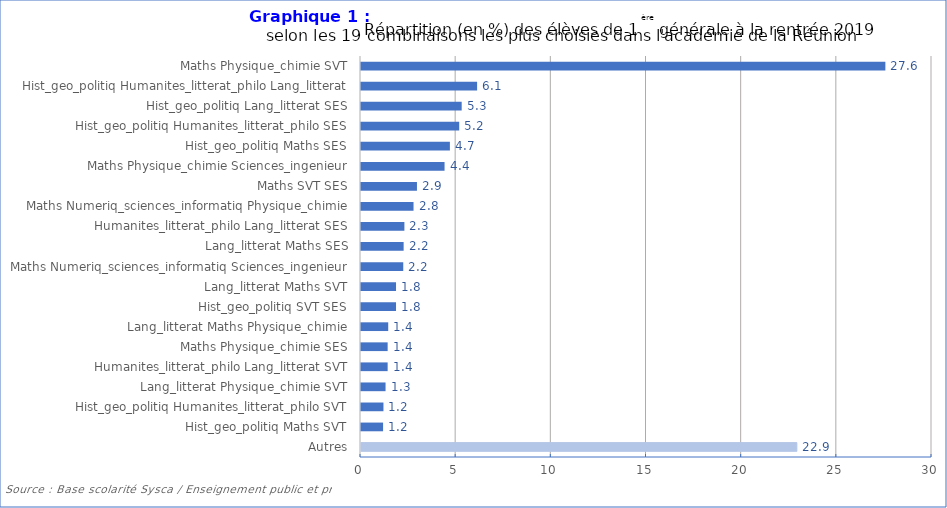
| Category | Series 1 |
|---|---|
| Autres | 22.9 |
| Hist_geo_politiq Maths SVT | 1.16 |
| Hist_geo_politiq Humanites_litterat_philo SVT | 1.18 |
| Lang_litterat Physique_chimie SVT | 1.29 |
| Humanites_litterat_philo Lang_litterat SVT | 1.4 |
| Maths Physique_chimie SES | 1.4 |
| Lang_litterat Maths Physique_chimie | 1.43 |
| Hist_geo_politiq SVT SES | 1.84 |
| Lang_litterat Maths SVT | 1.84 |
| Maths Numeriq_sciences_informatiq Sciences_ingenieur | 2.22 |
| Lang_litterat Maths SES | 2.24 |
| Humanites_litterat_philo Lang_litterat SES | 2.28 |
| Maths Numeriq_sciences_informatiq Physique_chimie | 2.76 |
| Maths SVT SES | 2.94 |
| Maths Physique_chimie Sciences_ingenieur | 4.39 |
| Hist_geo_politiq Maths SES | 4.67 |
| Hist_geo_politiq Humanites_litterat_philo SES | 5.16 |
| Hist_geo_politiq Lang_litterat SES | 5.29 |
| Hist_geo_politiq Humanites_litterat_philo Lang_litterat | 6.1 |
| Maths Physique_chimie SVT | 27.55 |